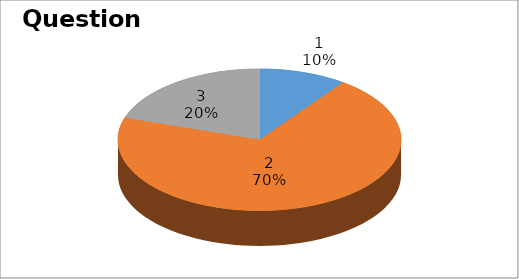
| Category | Series 0 |
|---|---|
| 0 | 1 |
| 1 | 7 |
| 2 | 2 |